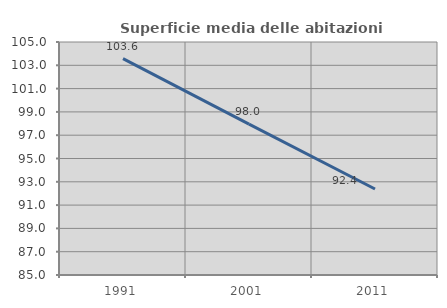
| Category | Superficie media delle abitazioni occupate |
|---|---|
| 1991.0 | 103.576 |
| 2001.0 | 97.954 |
| 2011.0 | 92.382 |